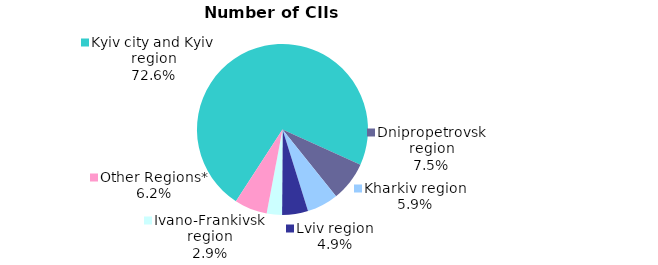
| Category | Series 0 |
|---|---|
| Kyiv city and Kyiv region | 0.726 |
| Dnipropetrovsk region | 0.075 |
| Kharkiv region | 0.059 |
| Lviv region | 0.049 |
| Ivano-Frankivsk region | 0.029 |
| Other Regions* | 0.062 |